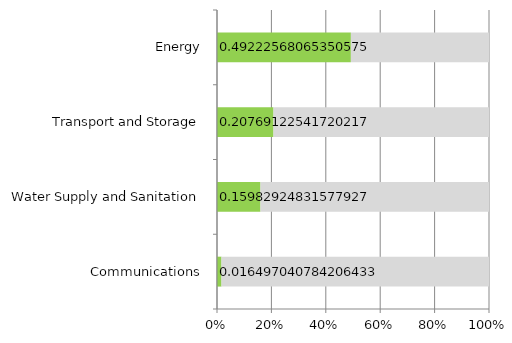
| Category | Series 0 | Series 1 |
|---|---|---|
| Communications | 47669.913 | 2841933.962 |
| Water Supply and Sanitation | 3234574.555 | 17003114.037 |
| Transport and Storage | 9081846.207 | 34645789.319 |
| Energy | 17614659.476 | 18171078.994 |